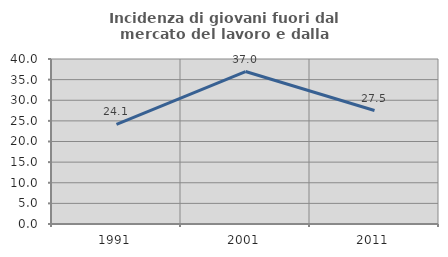
| Category | Incidenza di giovani fuori dal mercato del lavoro e dalla formazione  |
|---|---|
| 1991.0 | 24.129 |
| 2001.0 | 36.957 |
| 2011.0 | 27.511 |